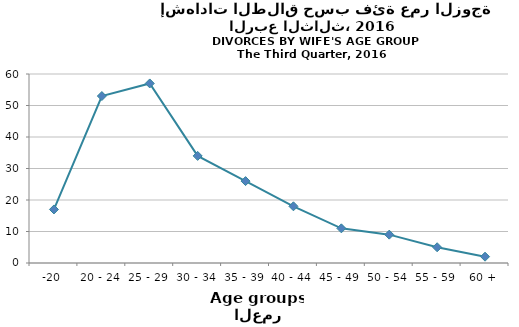
| Category | Series 0 |
|---|---|
| -20 | 17 |
| 20 - 24 | 53 |
| 25 - 29 | 57 |
| 30 - 34 | 34 |
| 35 - 39 | 26 |
| 40 - 44 | 18 |
| 45 - 49 | 11 |
| 50 - 54 | 9 |
| 55 - 59 | 5 |
| 60 + | 2 |